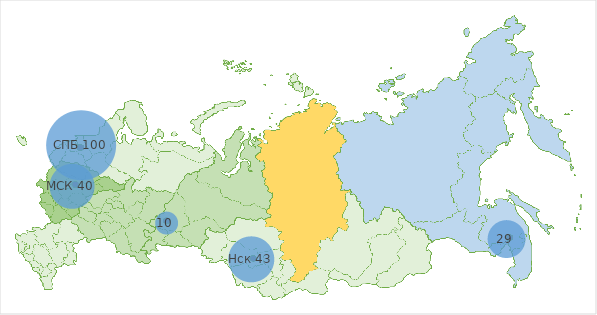
| Category | y |
|---|---|
| 25.0 | 10 |
| 6.0 | 28 |
| 7.0 | 38 |
| 52.0 | 15 |
| 16.0 | 19 |